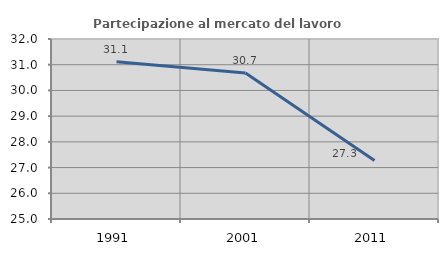
| Category | Partecipazione al mercato del lavoro  femminile |
|---|---|
| 1991.0 | 31.111 |
| 2001.0 | 30.682 |
| 2011.0 | 27.273 |